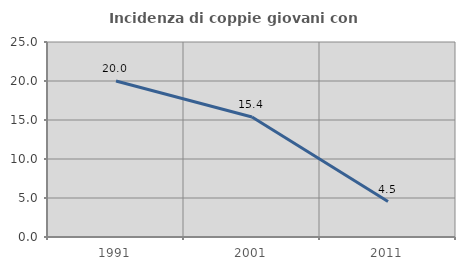
| Category | Incidenza di coppie giovani con figli |
|---|---|
| 1991.0 | 20 |
| 2001.0 | 15.385 |
| 2011.0 | 4.545 |